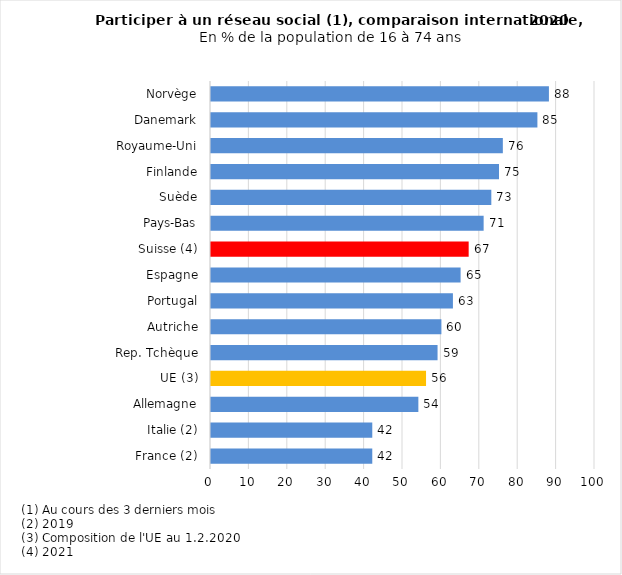
| Category | 2020 |
|---|---|
| France (2) | 42 |
| Italie (2) | 42 |
| Allemagne | 54 |
| UE (3) | 56 |
| Rep. Tchèque | 59 |
| Autriche | 60 |
| Portugal | 63 |
| Espagne | 65 |
| Suisse (4) | 67.102 |
| Pays-Bas | 71 |
| Suède | 73 |
| Finlande | 75 |
| Royaume-Uni | 76 |
| Danemark | 85 |
| Norvège | 88 |